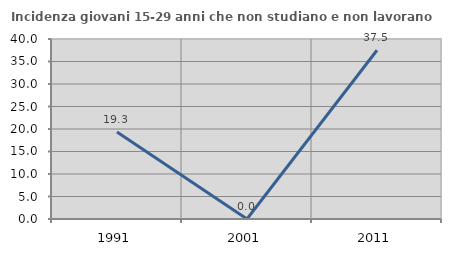
| Category | Incidenza giovani 15-29 anni che non studiano e non lavorano  |
|---|---|
| 1991.0 | 19.321 |
| 2001.0 | 0 |
| 2011.0 | 37.5 |